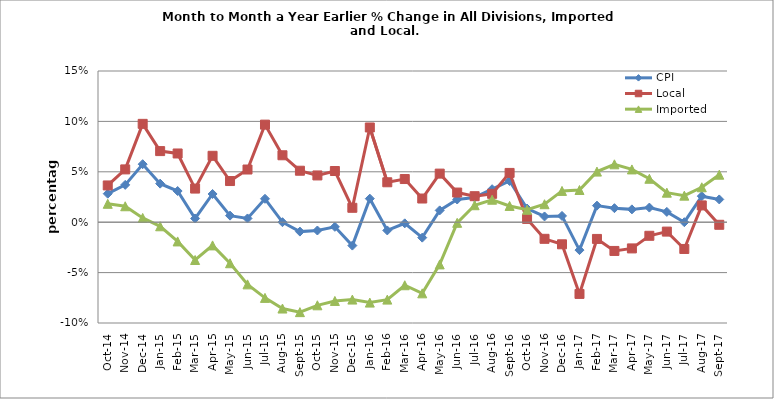
| Category | CPI | Local | Imported |
|---|---|---|---|
| 2014-10-02 | 0.028 | 0.036 | 0.018 |
| 2014-11-02 | 0.037 | 0.052 | 0.016 |
| 2014-12-02 | 0.058 | 0.098 | 0.004 |
| 2015-01-02 | 0.038 | 0.071 | -0.004 |
| 2015-02-02 | 0.031 | 0.068 | -0.019 |
| 2015-03-02 | 0.004 | 0.033 | -0.037 |
| 2015-04-02 | 0.028 | 0.066 | -0.023 |
| 2015-05-01 | 0.007 | 0.041 | -0.041 |
| 2015-06-01 | 0.004 | 0.052 | -0.062 |
| 2015-07-01 | 0.023 | 0.097 | -0.075 |
| 2015-08-01 | 0 | 0.066 | -0.086 |
| 2015-09-01 | -0.009 | 0.051 | -0.089 |
| 2015-10-01 | -0.008 | 0.046 | -0.082 |
| 2015-11-01 | -0.005 | 0.051 | -0.078 |
| 2015-12-01 | -0.023 | 0.014 | -0.077 |
| 2016-01-01 | 0.023 | 0.094 | -0.08 |
| 2016-02-01 | -0.008 | 0.04 | -0.077 |
| 2016-03-01 | -0.001 | 0.043 | -0.063 |
| 2016-04-01 | -0.015 | 0.023 | -0.071 |
| 2016-05-01 | 0.012 | 0.048 | -0.042 |
| 2016-06-01 | 0.023 | 0.029 | -0.001 |
| 2016-07-01 | 0.025 | 0.026 | 0.017 |
| 2016-08-01 | 0.033 | 0.028 | 0.022 |
| 2016-09-01 | 0.041 | 0.049 | 0.016 |
| 2016-10-01 | 0.014 | 0.003 | 0.012 |
| 2016-11-01 | 0.006 | -0.016 | 0.018 |
| 2016-12-01 | 0.006 | -0.022 | 0.031 |
| 2017-01-01 | -0.028 | -0.071 | 0.032 |
| 2017-02-01 | 0.016 | -0.017 | 0.05 |
| 2017-03-01 | 0.014 | -0.029 | 0.057 |
| 2017-04-01 | 0.013 | -0.026 | 0.052 |
| 2017-05-01 | 0.015 | -0.013 | 0.043 |
| 2017-06-01 | 0.01 | -0.009 | 0.029 |
| 2017-07-01 | 0 | -0.027 | 0.026 |
| 2017-08-01 | 0.026 | 0.017 | 0.035 |
| 2017-09-01 | 0.023 | -0.003 | 0.047 |